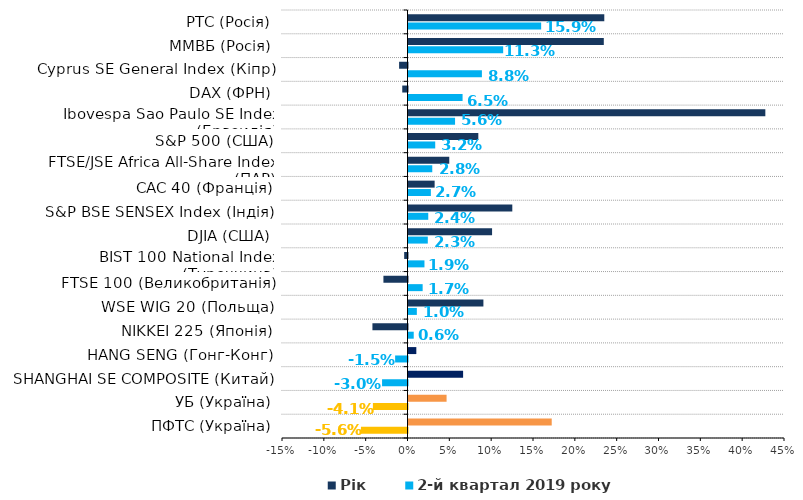
| Category | 2-й квартал 2019 року | Рік |
|---|---|---|
| ПФТС (Україна) | -0.056 | 0.171 |
| УБ (Україна) | -0.041 | 0.046 |
| SHANGHAI SE COMPOSITE (Китай) | -0.03 | 0.065 |
| HANG SENG (Гонг-Конг) | -0.015 | 0.009 |
| NIKKEI 225 (Японія) | 0.006 | -0.042 |
| WSE WIG 20 (Польща) | 0.01 | 0.09 |
| FTSE 100 (Великобританія) | 0.017 | -0.029 |
| BIST 100 National Index (Туреччина) | 0.019 | -0.004 |
| DJIA (США) | 0.023 | 0.1 |
| S&P BSE SENSEX Index (Індія) | 0.024 | 0.124 |
| CAC 40 (Франція) | 0.027 | 0.031 |
| FTSE/JSE Africa All-Share Index (ПАР) | 0.028 | 0.049 |
| S&P 500 (США) | 0.032 | 0.083 |
| Ibovespa Sao Paulo SE Index (Бразилія) | 0.056 | 0.427 |
| DAX (ФРН) | 0.065 | -0.006 |
| Cyprus SE General Index (Кіпр) | 0.088 | -0.01 |
| ММВБ (Росія) | 0.113 | 0.233 |
| РТС (Росія) | 0.159 | 0.234 |